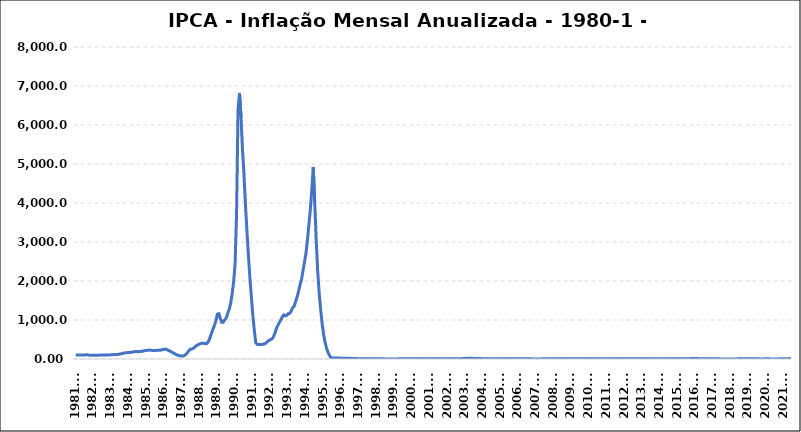
| Category | 99.25 |
|---|---|
| 1981.01 | 99.665 |
| 1981.02 | 103.07 |
| 1981.03 | 101.028 |
| 1981.04 | 103.273 |
| 1981.05 | 102.998 |
| 1981.06 | 103.407 |
| 1981.07 | 104.776 |
| 1981.08 | 105.85 |
| 1981.09 | 107.877 |
| 1981.10 | 99.517 |
| 1981.11 | 96.895 |
| 1981.12 | 95.623 |
| 1982.01 | 95.866 |
| 1982.02 | 96.299 |
| 1982.03 | 97.685 |
| 1982.04 | 96.617 |
| 1982.05 | 98.664 |
| 1982.06 | 101.653 |
| 1982.07 | 101.846 |
| 1982.08 | 102.759 |
| 1982.09 | 102.419 |
| 1982.10 | 101.195 |
| 1982.11 | 101.228 |
| 1982.12 | 104.8 |
| 1983.01 | 108 |
| 1983.02 | 110.382 |
| 1983.03 | 113.631 |
| 1983.04 | 115.026 |
| 1983.05 | 114.673 |
| 1983.06 | 120.235 |
| 1983.07 | 127.939 |
| 1983.08 | 134.69 |
| 1983.09 | 146.349 |
| 1983.10 | 156.784 |
| 1983.11 | 161.896 |
| 1983.12 | 164.012 |
| 1984.01 | 166.51 |
| 1984.02 | 170.569 |
| 1984.03 | 174.586 |
| 1984.04 | 182.221 |
| 1984.05 | 189.025 |
| 1984.06 | 189.551 |
| 1984.07 | 188.621 |
| 1984.08 | 189.25 |
| 1984.09 | 193.046 |
| 1984.10 | 197.274 |
| 1984.11 | 205.972 |
| 1984.12 | 215.263 |
| 1985.01 | 221.272 |
| 1985.02 | 225.276 |
| 1985.03 | 228.93 |
| 1985.04 | 224.883 |
| 1985.05 | 219.358 |
| 1985.06 | 214.756 |
| 1985.07 | 216.444 |
| 1985.08 | 224.259 |
| 1985.09 | 222.429 |
| 1985.10 | 222.952 |
| 1985.11 | 233.023 |
| 1985.12 | 242.23 |
| 1986.01 | 250.232 |
| 1986.02 | 256.079 |
| 1986.03 | 238.65 |
| 1986.04 | 215.44 |
| 1986.05 | 198.382 |
| 1986.06 | 178.521 |
| 1986.07 | 156.801 |
| 1986.08 | 137.328 |
| 1986.09 | 117.247 |
| 1986.10 | 100.135 |
| 1986.11 | 85.173 |
| 1986.12 | 79.664 |
| 1987.01 | 77.836 |
| 1987.02 | 77.711 |
| 1987.03 | 97.39 |
| 1987.04 | 133.27 |
| 1987.05 | 179.401 |
| 1987.06 | 230.273 |
| 1987.07 | 254.627 |
| 1987.08 | 259.138 |
| 1987.09 | 280.554 |
| 1987.10 | 315.348 |
| 1987.11 | 353.265 |
| 1987.12 | 363.412 |
| 1988.01 | 386.666 |
| 1988.02 | 399.9 |
| 1988.03 | 405.178 |
| 1988.04 | 405.985 |
| 1988.05 | 389.188 |
| 1988.06 | 398.54 |
| 1988.07 | 456.515 |
| 1988.08 | 545.241 |
| 1988.09 | 662.991 |
| 1988.10 | 761.776 |
| 1988.11 | 858.087 |
| 1988.12 | 980.213 |
| 1989.01 | 1149.216 |
| 1989.02 | 1160.878 |
| 1989.03 | 1045.292 |
| 1989.04 | 940.07 |
| 1989.05 | 944.502 |
| 1989.06 | 1001.436 |
| 1989.07 | 1054.108 |
| 1989.08 | 1169.15 |
| 1989.09 | 1269.825 |
| 1989.10 | 1424.124 |
| 1989.11 | 1660.949 |
| 1989.12 | 1972.912 |
| 1990.01 | 2426.121 |
| 1990.02 | 3701.295 |
| 1990.03 | 6390.528 |
| 1990.04 | 6821.312 |
| 1990.05 | 6214.994 |
| 1990.06 | 5385.43 |
| 1990.07 | 4749.029 |
| 1990.08 | 3993.623 |
| 1990.09 | 3304.706 |
| 1990.10 | 2685.735 |
| 1990.11 | 2101.338 |
| 1990.12 | 1620.966 |
| 1991.01 | 1140.267 |
| 1991.02 | 752.021 |
| 1991.03 | 422.839 |
| 1991.04 | 375.178 |
| 1991.05 | 374.479 |
| 1991.06 | 372.097 |
| 1991.07 | 369.961 |
| 1991.08 | 381.412 |
| 1991.09 | 386.548 |
| 1991.10 | 411.521 |
| 1991.11 | 448.306 |
| 1991.12 | 472.7 |
| 1992.01 | 497.317 |
| 1992.02 | 515.127 |
| 1992.03 | 567.214 |
| 1992.04 | 662.164 |
| 1992.05 | 785.806 |
| 1992.06 | 857.676 |
| 1992.07 | 937.939 |
| 1992.08 | 996.371 |
| 1992.09 | 1081.699 |
| 1992.10 | 1130.944 |
| 1992.11 | 1104.201 |
| 1992.12 | 1119.101 |
| 1993.01 | 1161.786 |
| 1993.02 | 1168.486 |
| 1993.03 | 1229.713 |
| 1993.04 | 1316.416 |
| 1993.05 | 1348.519 |
| 1993.06 | 1467.327 |
| 1993.07 | 1581.695 |
| 1993.08 | 1730.671 |
| 1993.09 | 1893.131 |
| 1993.10 | 2031.269 |
| 1993.11 | 2258.68 |
| 1993.12 | 2477.147 |
| 1994.01 | 2693.838 |
| 1994.02 | 3035.706 |
| 1994.03 | 3417.393 |
| 1994.04 | 3828.494 |
| 1994.05 | 4331.191 |
| 1994.06 | 4922.602 |
| 1994.07 | 4005.076 |
| 1994.08 | 3044.891 |
| 1994.09 | 2253.153 |
| 1994.10 | 1703.174 |
| 1994.11 | 1267.538 |
| 1994.12 | 916.46 |
| 1995.01 | 631.541 |
| 1995.02 | 426.829 |
| 1995.03 | 274.777 |
| 1995.04 | 169.051 |
| 1995.05 | 91.79 |
| 1995.06 | 33.029 |
| 1995.07 | 27.451 |
| 1995.08 | 26.362 |
| 1995.09 | 25.69 |
| 1995.10 | 24.208 |
| 1995.11 | 22.59 |
| 1995.12 | 22.409 |
| 1996.01 | 21.976 |
| 1996.02 | 21.988 |
| 1996.03 | 20.546 |
| 1996.04 | 19.169 |
| 1996.05 | 17.486 |
| 1996.06 | 16.257 |
| 1996.07 | 14.837 |
| 1996.08 | 14.212 |
| 1996.09 | 13.262 |
| 1996.10 | 12.022 |
| 1996.11 | 10.752 |
| 1996.12 | 9.564 |
| 1997.01 | 9.391 |
| 1997.02 | 8.817 |
| 1997.03 | 8.99 |
| 1997.04 | 8.581 |
| 1997.05 | 7.713 |
| 1997.06 | 7.021 |
| 1997.07 | 6.079 |
| 1997.08 | 5.593 |
| 1997.09 | 5.498 |
| 1997.10 | 5.424 |
| 1997.11 | 5.267 |
| 1997.12 | 5.225 |
| 1998.01 | 4.736 |
| 1998.02 | 4.569 |
| 1998.03 | 4.392 |
| 1998.04 | 3.73 |
| 1998.05 | 3.823 |
| 1998.06 | 3.286 |
| 1998.07 | 2.936 |
| 1998.08 | 2.431 |
| 1998.09 | 2.145 |
| 1998.10 | 1.931 |
| 1998.11 | 1.635 |
| 1998.12 | 1.534 |
| 1999.01 | 1.524 |
| 1999.02 | 2.243 |
| 1999.03 | 3.017 |
| 1999.04 | 3.346 |
| 1999.05 | 3.14 |
| 1999.06 | 3.315 |
| 1999.07 | 4.567 |
| 1999.08 | 5.692 |
| 1999.09 | 6.253 |
| 1999.10 | 7.496 |
| 1999.11 | 8.648 |
| 1999.12 | 8.94 |
| 2000.01 | 8.853 |
| 2000.02 | 7.862 |
| 2000.03 | 6.923 |
| 2000.04 | 6.775 |
| 2000.05 | 6.466 |
| 2000.06 | 6.508 |
| 2000.07 | 7.056 |
| 2000.08 | 7.855 |
| 2000.09 | 7.769 |
| 2000.10 | 6.65 |
| 2000.11 | 5.985 |
| 2000.12 | 5.974 |
| 2001.01 | 5.922 |
| 2001.02 | 6.271 |
| 2001.03 | 6.44 |
| 2001.04 | 6.61 |
| 2001.05 | 7.036 |
| 2001.06 | 7.346 |
| 2001.07 | 7.05 |
| 2001.08 | 6.406 |
| 2001.09 | 6.459 |
| 2001.10 | 7.192 |
| 2001.11 | 7.609 |
| 2001.12 | 7.673 |
| 2002.01 | 7.62 |
| 2002.02 | 7.513 |
| 2002.03 | 7.748 |
| 2002.04 | 7.984 |
| 2002.05 | 7.769 |
| 2002.06 | 7.662 |
| 2002.07 | 7.513 |
| 2002.08 | 7.459 |
| 2002.09 | 7.931 |
| 2002.10 | 8.445 |
| 2002.11 | 10.932 |
| 2002.12 | 12.53 |
| 2003.01 | 14.467 |
| 2003.02 | 15.847 |
| 2003.03 | 16.573 |
| 2003.04 | 16.769 |
| 2003.05 | 17.235 |
| 2003.06 | 16.57 |
| 2003.07 | 15.429 |
| 2003.08 | 15.074 |
| 2003.09 | 15.142 |
| 2003.10 | 13.983 |
| 2003.11 | 11.018 |
| 2003.12 | 9.3 |
| 2004.01 | 7.707 |
| 2004.02 | 6.689 |
| 2004.03 | 5.888 |
| 2004.04 | 5.259 |
| 2004.05 | 5.154 |
| 2004.06 | 6.06 |
| 2004.07 | 6.812 |
| 2004.08 | 7.184 |
| 2004.09 | 6.706 |
| 2004.10 | 6.865 |
| 2004.11 | 7.238 |
| 2004.12 | 7.601 |
| 2005.01 | 7.408 |
| 2005.02 | 7.387 |
| 2005.03 | 7.537 |
| 2005.04 | 8.072 |
| 2005.05 | 8.051 |
| 2005.06 | 7.268 |
| 2005.07 | 6.566 |
| 2005.08 | 6.016 |
| 2005.09 | 6.037 |
| 2005.10 | 6.364 |
| 2005.11 | 6.216 |
| 2005.12 | 5.69 |
| 2006.01 | 5.7 |
| 2006.02 | 5.511 |
| 2006.03 | 5.322 |
| 2006.04 | 4.633 |
| 2006.05 | 4.227 |
| 2006.06 | 4.029 |
| 2006.07 | 3.967 |
| 2006.08 | 3.842 |
| 2006.09 | 3.697 |
| 2006.10 | 3.265 |
| 2006.11 | 3.019 |
| 2006.12 | 3.142 |
| 2007.01 | 2.988 |
| 2007.02 | 3.019 |
| 2007.03 | 2.957 |
| 2007.04 | 2.998 |
| 2007.05 | 3.184 |
| 2007.06 | 3.69 |
| 2007.07 | 3.742 |
| 2007.08 | 4.177 |
| 2007.09 | 4.146 |
| 2007.10 | 4.115 |
| 2007.11 | 4.188 |
| 2007.12 | 4.457 |
| 2008.01 | 4.561 |
| 2008.02 | 4.613 |
| 2008.03 | 4.728 |
| 2008.04 | 5.041 |
| 2008.05 | 5.576 |
| 2008.06 | 6.06 |
| 2008.07 | 6.367 |
| 2008.08 | 6.166 |
| 2008.09 | 6.25 |
| 2008.10 | 6.409 |
| 2008.11 | 6.388 |
| 2008.12 | 5.902 |
| 2009.01 | 5.839 |
| 2009.02 | 5.902 |
| 2009.03 | 5.607 |
| 2009.04 | 5.534 |
| 2009.05 | 5.199 |
| 2009.06 | 4.802 |
| 2009.07 | 4.499 |
| 2009.08 | 4.364 |
| 2009.09 | 4.343 |
| 2009.10 | 4.167 |
| 2009.11 | 4.218 |
| 2009.12 | 4.312 |
| 2010.01 | 4.592 |
| 2010.02 | 4.832 |
| 2010.03 | 5.166 |
| 2010.04 | 5.261 |
| 2010.05 | 5.219 |
| 2010.06 | 4.841 |
| 2010.07 | 4.601 |
| 2010.08 | 4.486 |
| 2010.09 | 4.705 |
| 2010.10 | 5.195 |
| 2010.11 | 5.635 |
| 2010.12 | 5.909 |
| 2011.01 | 5.993 |
| 2011.02 | 6.014 |
| 2011.03 | 6.299 |
| 2011.04 | 6.51 |
| 2011.05 | 6.553 |
| 2011.06 | 6.713 |
| 2011.07 | 6.873 |
| 2011.08 | 7.225 |
| 2011.09 | 7.311 |
| 2011.10 | 6.97 |
| 2011.11 | 6.641 |
| 2011.12 | 6.503 |
| 2012.01 | 6.218 |
| 2012.02 | 5.849 |
| 2012.03 | 5.24 |
| 2012.04 | 5.104 |
| 2012.05 | 4.989 |
| 2012.06 | 4.916 |
| 2012.07 | 5.199 |
| 2012.08 | 5.241 |
| 2012.09 | 5.282 |
| 2012.10 | 5.45 |
| 2012.11 | 5.534 |
| 2012.12 | 5.839 |
| 2013.01 | 6.154 |
| 2013.02 | 6.313 |
| 2013.03 | 6.589 |
| 2013.04 | 6.493 |
| 2013.05 | 6.504 |
| 2013.06 | 6.696 |
| 2013.07 | 6.271 |
| 2013.08 | 6.091 |
| 2013.09 | 5.859 |
| 2013.10 | 5.838 |
| 2013.11 | 5.774 |
| 2013.12 | 5.911 |
| 2014.01 | 5.585 |
| 2014.02 | 5.68 |
| 2014.03 | 6.153 |
| 2014.04 | 6.28 |
| 2014.05 | 6.375 |
| 2014.06 | 6.524 |
| 2014.07 | 6.502 |
| 2014.08 | 6.513 |
| 2014.09 | 6.746 |
| 2014.10 | 6.587 |
| 2014.11 | 6.555 |
| 2014.12 | 6.408 |
| 2015.01 | 7.138 |
| 2015.02 | 7.702 |
| 2015.03 | 8.129 |
| 2015.04 | 8.172 |
| 2015.05 | 8.473 |
| 2015.06 | 8.894 |
| 2015.07 | 9.559 |
| 2015.08 | 9.526 |
| 2015.09 | 9.493 |
| 2015.10 | 9.929 |
| 2015.11 | 10.476 |
| 2015.12 | 10.673 |
| 2016.01 | 10.706 |
| 2016.02 | 10.356 |
| 2016.03 | 9.387 |
| 2016.04 | 9.278 |
| 2016.05 | 9.322 |
| 2016.06 | 8.844 |
| 2016.07 | 8.736 |
| 2016.08 | 8.975 |
| 2016.09 | 8.476 |
| 2016.10 | 7.874 |
| 2016.11 | 6.987 |
| 2016.12 | 6.288 |
| 2017.01 | 5.354 |
| 2017.02 | 4.759 |
| 2017.03 | 4.571 |
| 2017.04 | 4.083 |
| 2017.05 | 3.597 |
| 2017.06 | 2.998 |
| 2017.07 | 2.711 |
| 2017.08 | 2.456 |
| 2017.09 | 2.538 |
| 2017.10 | 2.701 |
| 2017.11 | 2.804 |
| 2017.12 | 2.947 |
| 2018.01 | 2.855 |
| 2018.02 | 2.845 |
| 2018.03 | 2.681 |
| 2018.04 | 2.763 |
| 2018.05 | 2.855 |
| 2018.06 | 4.391 |
| 2018.07 | 4.485 |
| 2018.08 | 4.193 |
| 2018.09 | 4.526 |
| 2018.10 | 4.557 |
| 2018.11 | 4.046 |
| 2018.12 | 3.745 |
| 2019.01 | 3.777 |
| 2019.02 | 3.89 |
| 2019.03 | 4.575 |
| 2019.04 | 4.941 |
| 2019.05 | 4.658 |
| 2019.06 | 3.366 |
| 2019.07 | 3.222 |
| 2019.08 | 3.429 |
| 2019.09 | 2.894 |
| 2019.10 | 2.535 |
| 2019.11 | 3.275 |
| 2019.12 | 4.306 |
| 2020.01 | 4.192 |
| 2020.02 | 4.005 |
| 2020.03 | 3.303 |
| 2020.04 | 2.399 |
| 2020.05 | 1.877 |
| 2020.06 | 2.132 |
| 2020.07 | 2.305 |
| 2020.08 | 2.438 |
| 2020.09 | 3.135 |
| 2020.10 | 3.918 |
| 2020.11 | 4.311 |
| 2020.12 | 4.517 |
| 2021.01 | 4.559 |
| 2021.02 | 5.195 |
| 2021.03 | 6.099 |
| 2021.04 | 6.759 |
| 2021.05 | 8.056 |
| 2021.06 | 8.347 |